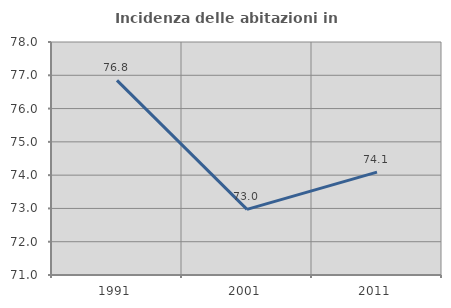
| Category | Incidenza delle abitazioni in proprietà  |
|---|---|
| 1991.0 | 76.849 |
| 2001.0 | 72.973 |
| 2011.0 | 74.092 |